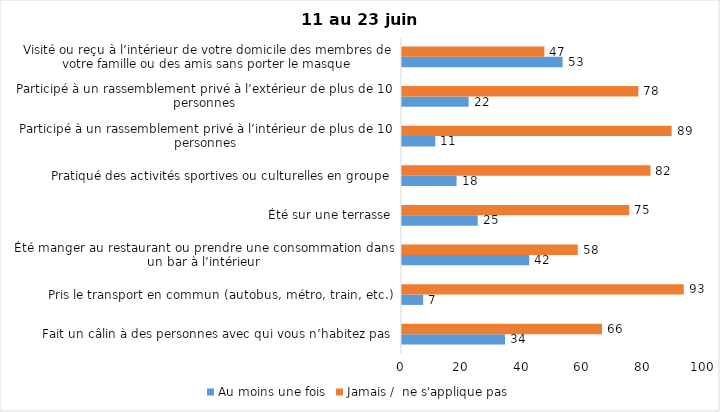
| Category | Au moins une fois | Jamais /  ne s'applique pas |
|---|---|---|
| Fait un câlin à des personnes avec qui vous n’habitez pas | 34 | 66 |
| Pris le transport en commun (autobus, métro, train, etc.) | 7 | 93 |
| Été manger au restaurant ou prendre une consommation dans un bar à l’intérieur | 42 | 58 |
| Été sur une terrasse | 25 | 75 |
| Pratiqué des activités sportives ou culturelles en groupe | 18 | 82 |
| Participé à un rassemblement privé à l’intérieur de plus de 10 personnes | 11 | 89 |
| Participé à un rassemblement privé à l’extérieur de plus de 10 personnes | 22 | 78 |
| Visité ou reçu à l’intérieur de votre domicile des membres de votre famille ou des amis sans porter le masque | 53 | 47 |